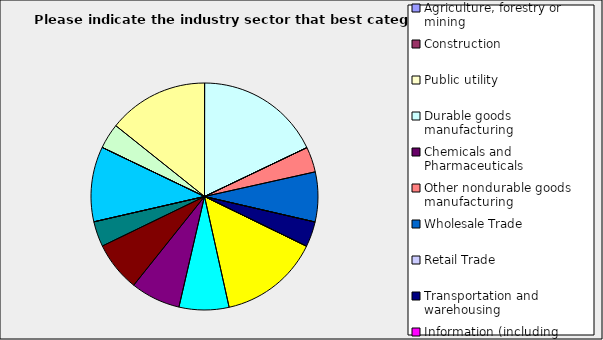
| Category | Series 0 |
|---|---|
| Agriculture, forestry or mining | 0 |
| Construction | 0 |
| Public utility | 0 |
| Durable goods manufacturing | 0.179 |
| Chemicals and Pharmaceuticals | 0 |
| Other nondurable goods manufacturing | 0.036 |
| Wholesale Trade | 0.071 |
| Retail Trade | 0 |
| Transportation and warehousing | 0.036 |
| Information (including broadcasting and telecommunication) | 0 |
| Finance and Insurance | 0.143 |
| Real Estate | 0.071 |
| Professional, scientific and technical services | 0.071 |
| Consulting | 0.071 |
| Administrative and office services (including waste management) | 0.036 |
| Education | 0 |
| Health Care and social services | 0.107 |
| Arts, entertainment and recreation | 0 |
| Accommodation and food services | 0.036 |
| Other | 0.143 |